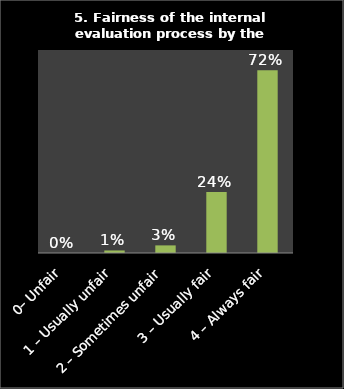
| Category | Series 0 |
|---|---|
| 0– Unfair | 0 |
| 1 – Usually unfair | 0.01 |
| 2 – Sometimes unfair | 0.03 |
| 3 – Usually fair | 0.24 |
| 4 – Always fair | 0.72 |